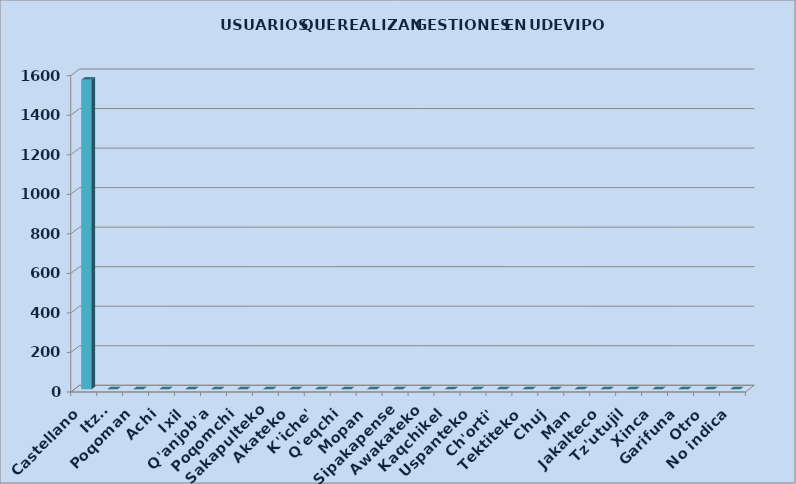
| Category | Series 0 |
|---|---|
| Castellano | 1566 |
| Itza' | 0 |
| Poqoman | 0 |
| Achi | 0 |
| Ixil | 0 |
| Q'anjob'a | 0 |
| Poqomchi | 0 |
| Sakapulteko | 0 |
| Akateko | 0 |
| K'iche' | 0 |
| Q'eqchi | 0 |
| Mopan | 0 |
| Sipakapense | 0 |
| Awakateko | 0 |
| Kaqchikel | 0 |
| Uspanteko | 0 |
| Ch'orti' | 0 |
| Tektiteko | 0 |
| Chuj | 0 |
| Man | 0 |
| Jakalteco | 0 |
| Tz'utujil | 0 |
| Xinca | 0 |
| Garifuna | 0 |
| Otro | 0 |
| No indica | 0 |